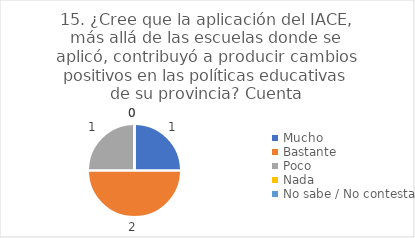
| Category | 15. ¿Cree que la aplicación del IACE, más allá de las escuelas donde se aplicó, contribuyó a producir cambios positivos en las políticas educativas de su provincia? |
|---|---|
| Mucho  | 0.25 |
| Bastante  | 0.5 |
| Poco  | 0.25 |
| Nada  | 0 |
| No sabe / No contesta | 0 |